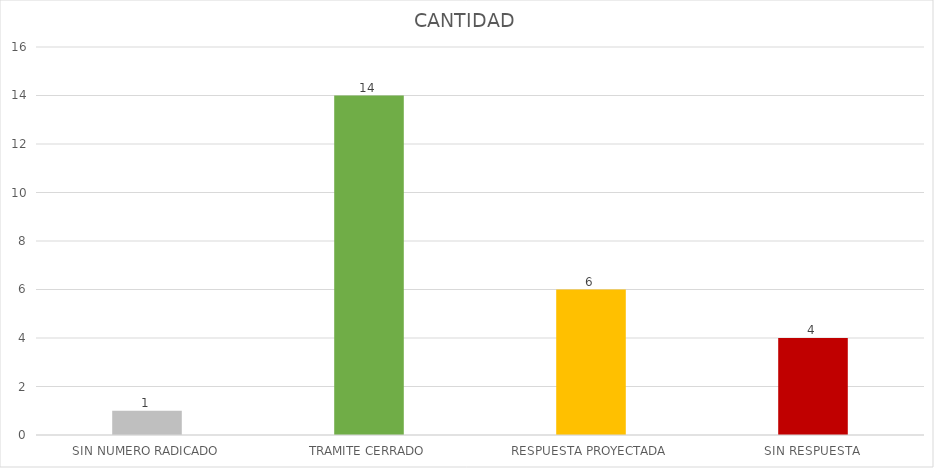
| Category | CANTIDAD |
|---|---|
| SIN NUMERO RADICADO | 1 |
| TRAMITE CERRADO | 14 |
| RESPUESTA PROYECTADA | 6 |
| SIN RESPUESTA | 4 |